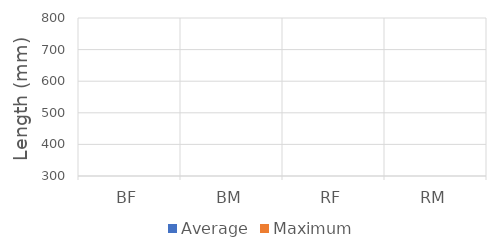
| Category | Average | Maximum |
|---|---|---|
| BF | 0 | 0 |
| BM | 0 | 0 |
| RF | 0 | 0 |
| RM | 0 | 0 |